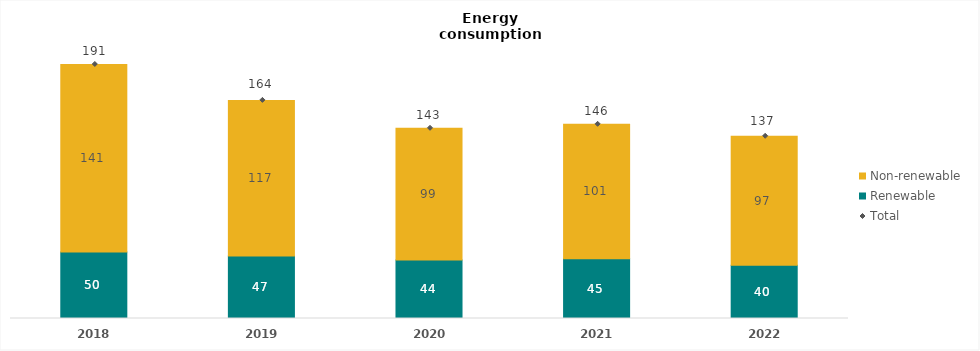
| Category | Renewable | Non-renewable |
|---|---|---|
| 2018.0 | 50 | 141 |
| 2019.0 | 47 | 117 |
| 2020.0 | 44 | 99 |
| 2021.0 | 45 | 101 |
| 2022.0 | 40 | 97 |